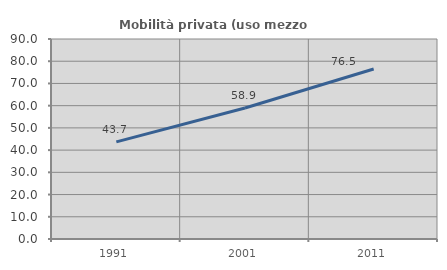
| Category | Mobilità privata (uso mezzo privato) |
|---|---|
| 1991.0 | 43.696 |
| 2001.0 | 58.931 |
| 2011.0 | 76.522 |